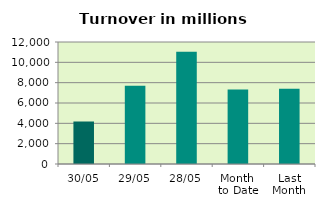
| Category | Series 0 |
|---|---|
| 30/05 | 4176.658 |
| 29/05 | 7703.941 |
| 28/05 | 11038.631 |
| Month 
to Date | 7326.475 |
| Last
Month | 7412.755 |